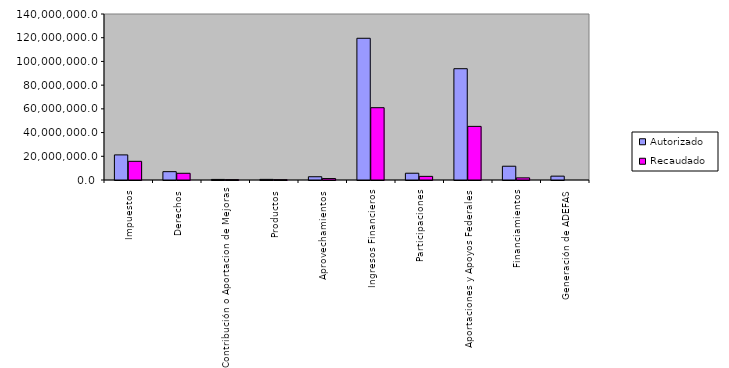
| Category | Autorizado | Recaudado |
|---|---|---|
| 0 | 21168954.6 | 15750770.9 |
| 1 | 7025502.5 | 5664022.2 |
| 2 | 481215.9 | 290758.5 |
| 3 | 523505.1 | 254475.1 |
| 4 | 2742104.7 | 1222388.8 |
| 5 | 119522887.5 | 60978478.4 |
| 6 | 5716826.6 | 3063718.9 |
| 7 | 93864085.8 | 45215791.4 |
| 8 | 11609817.9 | 1800830.6 |
| 9 | 3243691 | 0 |